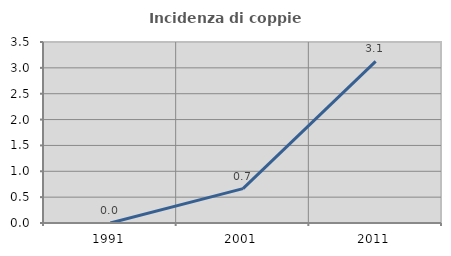
| Category | Incidenza di coppie miste |
|---|---|
| 1991.0 | 0 |
| 2001.0 | 0.664 |
| 2011.0 | 3.125 |